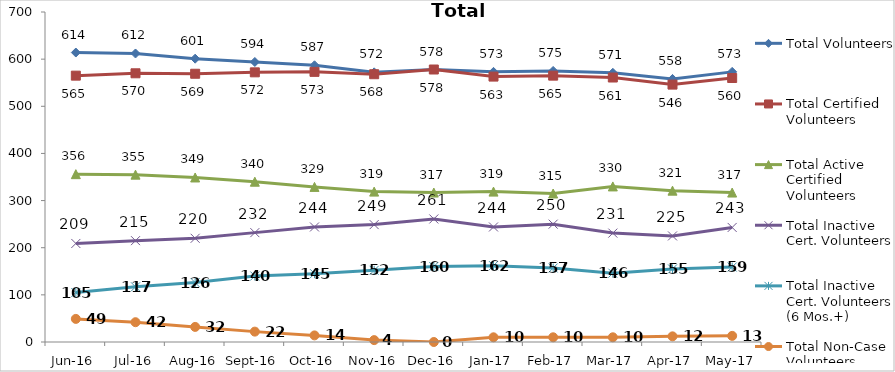
| Category | Total Volunteers | Total Certified Volunteers | Total Active Certified Volunteers | Total Inactive Cert. Volunteers | Total Inactive Cert. Volunteers (6 Mos.+) | Total Non-Case Volunteers |
|---|---|---|---|---|---|---|
| Jun-16 | 614 | 565 | 356 | 209 | 105 | 49 |
| Jul-16 | 612 | 570 | 355 | 215 | 117 | 42 |
| Aug-16 | 601 | 569 | 349 | 220 | 126 | 32 |
| Sep-16 | 594 | 572 | 340 | 232 | 140 | 22 |
| Oct-16 | 587 | 573 | 329 | 244 | 145 | 14 |
| Nov-16 | 572 | 568 | 319 | 249 | 152 | 4 |
| Dec-16 | 578 | 578 | 317 | 261 | 160 | 0 |
| Jan-17 | 573 | 563 | 319 | 244 | 162 | 10 |
| Feb-17 | 575 | 565 | 315 | 250 | 157 | 10 |
| Mar-17 | 571 | 561 | 330 | 231 | 146 | 10 |
| Apr-17 | 558 | 546 | 321 | 225 | 155 | 12 |
| May-17 | 573 | 560 | 317 | 243 | 159 | 13 |